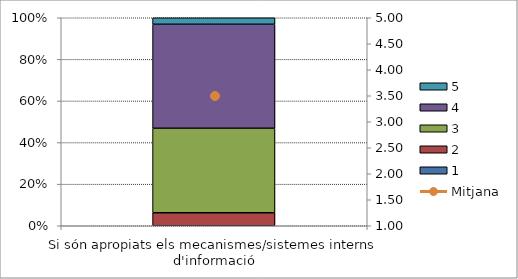
| Category | 1 | 2 | 3 | 4 | 5 |
|---|---|---|---|---|---|
| Si són apropiats els mecanismes/sistemes interns d'informació | 0 | 2 | 13 | 16 | 1 |